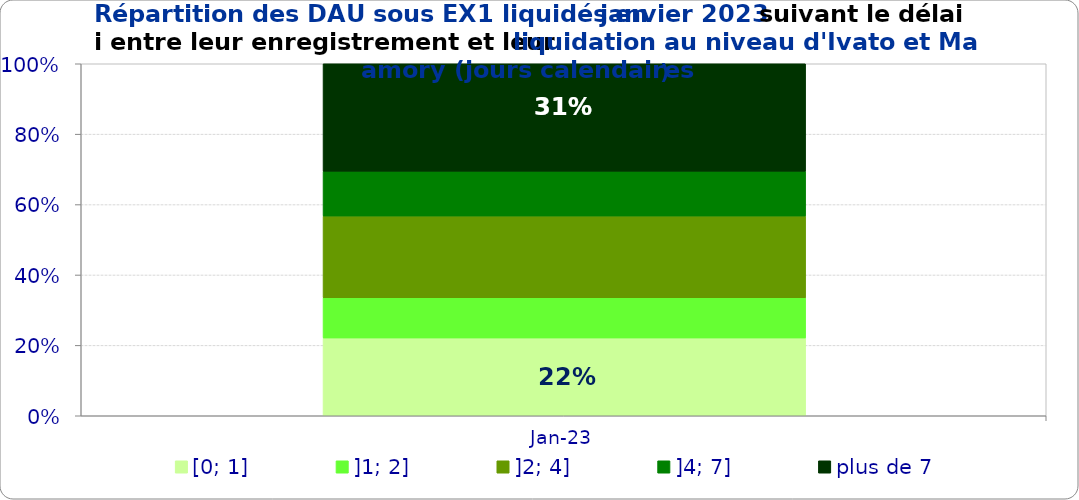
| Category | [0; 1] | ]1; 2] | ]2; 4] | ]4; 7] | plus de 7 |
|---|---|---|---|---|---|
| 2023-01-01 | 0.221 | 0.114 | 0.232 | 0.127 | 0.305 |